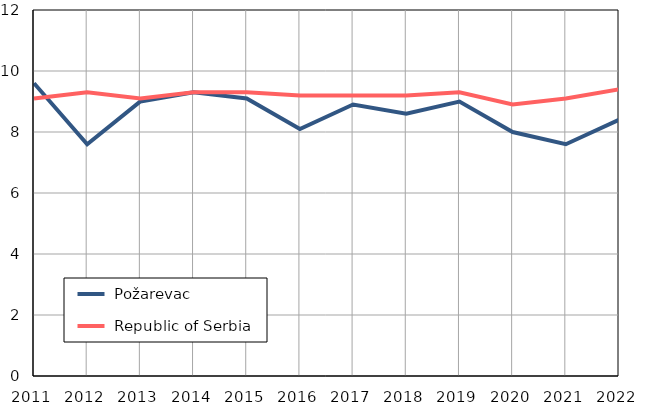
| Category |  Požarevac |  Republic of Serbia |
|---|---|---|
| 2011.0 | 9.6 | 9.1 |
| 2012.0 | 7.6 | 9.3 |
| 2013.0 | 9 | 9.1 |
| 2014.0 | 9.3 | 9.3 |
| 2015.0 | 9.1 | 9.3 |
| 2016.0 | 8.1 | 9.2 |
| 2017.0 | 8.9 | 9.2 |
| 2018.0 | 8.6 | 9.2 |
| 2019.0 | 9 | 9.3 |
| 2020.0 | 8 | 8.9 |
| 2021.0 | 7.6 | 9.1 |
| 2022.0 | 8.4 | 9.4 |